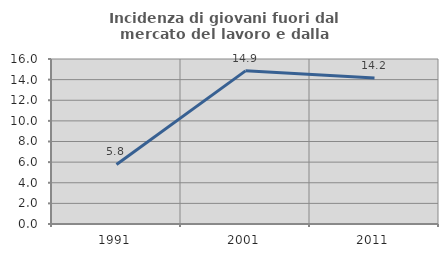
| Category | Incidenza di giovani fuori dal mercato del lavoro e dalla formazione  |
|---|---|
| 1991.0 | 5.774 |
| 2001.0 | 14.851 |
| 2011.0 | 14.167 |